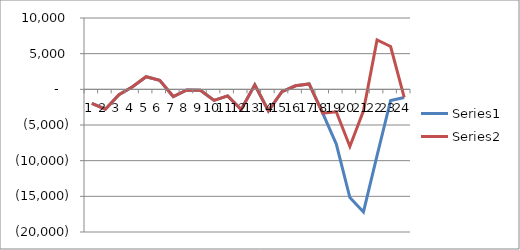
| Category | Series 0 | Series 1 |
|---|---|---|
| 0 | -1963 | -1963 |
| 1 | -2792 | -2792 |
| 2 | -747 | -747 |
| 3 | 365 | 365 |
| 4 | 1768 | 1768 |
| 5 | 1264 | 1264 |
| 6 | -1011 | -1011 |
| 7 | -92 | -92 |
| 8 | -121 | -121 |
| 9 | -1556 | -1556 |
| 10 | -919 | -919 |
| 11 | -2820 | -2820 |
| 12 | 625 | 625 |
| 13 | -3009 | -3009 |
| 14 | -335 | -335 |
| 15 | 498 | 498 |
| 16 | 751 | 751 |
| 17 | -3349 | -3349 |
| 18 | -7667 | -3153 |
| 19 | -15173 | -8007 |
| 20 | -17190 | -3023 |
| 21 | -9302 | 6914 |
| 22 | -1560 | 6002 |
| 23 | -1133 | -1133 |